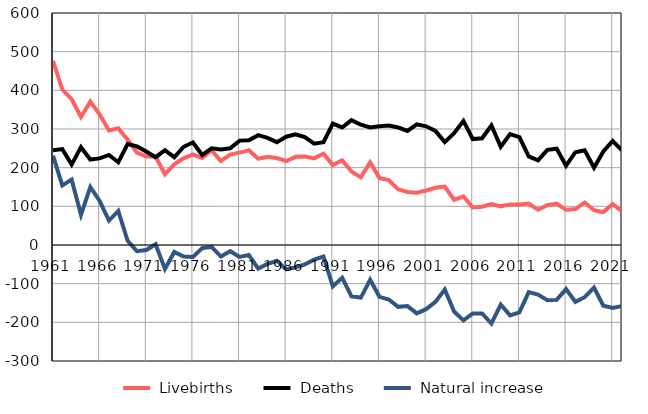
| Category |  Livebirths |  Deaths |  Natural increase |
|---|---|---|---|
| 1961.0 | 476 | 245 | 231 |
| 1962.0 | 402 | 248 | 154 |
| 1963.0 | 377 | 208 | 169 |
| 1964.0 | 331 | 253 | 78 |
| 1965.0 | 371 | 221 | 150 |
| 1966.0 | 338 | 224 | 114 |
| 1967.0 | 296 | 233 | 63 |
| 1968.0 | 302 | 214 | 88 |
| 1969.0 | 272 | 261 | 11 |
| 1970.0 | 239 | 255 | -16 |
| 1971.0 | 229 | 242 | -13 |
| 1972.0 | 229 | 227 | 2 |
| 1973.0 | 183 | 245 | -62 |
| 1974.0 | 209 | 227 | -18 |
| 1975.0 | 224 | 254 | -30 |
| 1976.0 | 234 | 265 | -31 |
| 1977.0 | 225 | 233 | -8 |
| 1978.0 | 245 | 250 | -5 |
| 1979.0 | 217 | 247 | -30 |
| 1980.0 | 234 | 250 | -16 |
| 1981.0 | 239 | 270 | -31 |
| 1982.0 | 245 | 271 | -26 |
| 1983.0 | 223 | 284 | -61 |
| 1984.0 | 228 | 277 | -49 |
| 1985.0 | 225 | 266 | -41 |
| 1986.0 | 217 | 280 | -63 |
| 1987.0 | 228 | 286 | -58 |
| 1988.0 | 229 | 279 | -50 |
| 1989.0 | 224 | 262 | -38 |
| 1990.0 | 236 | 266 | -30 |
| 1991.0 | 207 | 314 | -107 |
| 1992.0 | 219 | 304 | -85 |
| 1993.0 | 190 | 323 | -133 |
| 1994.0 | 175 | 311 | -136 |
| 1995.0 | 214 | 304 | -90 |
| 1996.0 | 173 | 307 | -134 |
| 1997.0 | 168 | 309 | -141 |
| 1998.0 | 144 | 304 | -160 |
| 1999.0 | 137 | 295 | -158 |
| 2000.0 | 135 | 312 | -177 |
| 2001.0 | 141 | 307 | -166 |
| 2002.0 | 148 | 295 | -147 |
| 2003.0 | 151 | 266 | -115 |
| 2004.0 | 117 | 289 | -172 |
| 2005.0 | 126 | 321 | -195 |
| 2006.0 | 97 | 274 | -177 |
| 2007.0 | 99 | 276 | -177 |
| 2008.0 | 106 | 309 | -203 |
| 2009.0 | 100 | 254 | -154 |
| 2010.0 | 105 | 287 | -182 |
| 2011.0 | 105 | 279 | -174 |
| 2012.0 | 107 | 229 | -122 |
| 2013.0 | 91 | 219 | -128 |
| 2014.0 | 103 | 246 | -143 |
| 2015.0 | 107 | 249 | -142 |
| 2016.0 | 91 | 205 | -114 |
| 2017.0 | 93 | 240 | -147 |
| 2018.0 | 110 | 245 | -135 |
| 2019.0 | 90 | 200 | -110 |
| 2020.0 | 85 | 242 | -157 |
| 2021.0 | 106 | 269 | -163 |
| 2022.0 | 87 | 245 | -158 |